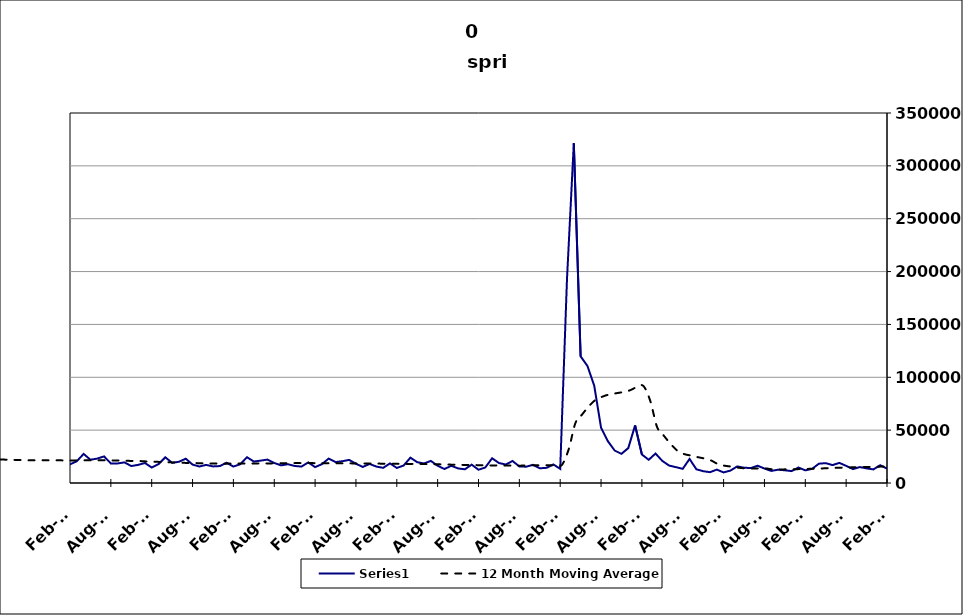
| Category | Series 0 |
|---|---|
| 2005-06-30 | 15559 |
| 2005-07-31 | 18863 |
| 2005-08-31 | 13688 |
| 2005-09-30 | 11216 |
| 2005-10-31 | 15195 |
| 2005-11-30 | 11106 |
| 2005-12-31 | 12178 |
| 2006-01-31 | 12307 |
| 2006-02-28 | 9756 |
| 2006-03-31 | 11166 |
| 2006-04-30 | 18194 |
| 2006-05-31 | 13863 |
| 2006-06-30 | 14337 |
| 2006-07-31 | 17845 |
| 2006-08-31 | 13259 |
| 2006-09-30 | 13170 |
| 2006-10-31 | 14318 |
| 2006-11-30 | 12528 |
| 2006-12-31 | 14662 |
| 2007-01-31 | 14365 |
| 2007-02-28 | 12004 |
| 2007-03-31 | 15715 |
| 2007-04-30 | 21487 |
| 2007-05-31 | 15927 |
| 2007-06-30 | 20117 |
| 2007-07-30 | 19634 |
| 2007-08-31 | 15908 |
| 2007-09-30 | 17289 |
| 2007-10-31 | 17016 |
| 2007-11-15 | 14868 |
| 2007-12-15 09:36:00 | 15051 |
| 2008-01-14 19:12:00 | 19519 |
| 2008-02-14 04:48:00 | 17071 |
| 2008-03-15 14:24:00 | 18041 |
| 2008-04-15 | 26337 |
| 2008-05-15 09:36:00 | 21529 |
| 2008-06-14 19:12:00 | 24509 |
| 2008-07-15 04:48:00 | 26739 |
| 2008-08-14 14:24:00 | 22508 |
| 2008-09-14 | 24197 |
| 2008-10-14 09:36:00 | 30666 |
| 2008-11-13 19:12:00 | 30363 |
| 2008-12-14 04:48:00 | 34409 |
| 2009-01-13 14:24:00 | 39076 |
| 2009-02-13 | 34958 |
| 2009-03-15 09:36:00 | 39174 |
| 2009-04-14 19:12:00 | 41068 |
| 2009-05-15 04:48:00 | 34839 |
| 2009-06-14 14:24:00 | 38758 |
| 2009-07-15 | 38827 |
| 2009-08-14 09:36:00 | 32747 |
| 2009-09-13 19:12:00 | 30654 |
| 2009-10-14 04:48:00 | 31279 |
| 2009-11-13 14:24:00 | 28764 |
| 2009-12-14 | 28567 |
| 2010-01-13 09:36:00 | 31536 |
| 2010-02-12 19:12:00 | 23411 |
| 2010-03-15 04:48:00 | 27064 |
| 2010-04-14 14:24:00 | 31806 |
| 2010-05-15 | 27535 |
| 2010-06-14 09:36:00 | 30999 |
| 2010-07-14 19:12:00 | 30859 |
| 2010-08-14 04:48:00 | 27473 |
| 2010-09-13 14:24:00 | 23569 |
| 2010-10-14 | 26397 |
| 2010-11-13 09:36:00 | 23332 |
| 2010-12-13 19:12:00 | 23208 |
| 2011-01-13 04:48:00 | 29123 |
| 2011-02-12 14:24:00 | 19880 |
| 2011-03-15 | 23037 |
| 2011-04-14 09:36:00 | 29838 |
| 2011-05-14 19:12:00 | 26805 |
| 2011-06-14 04:48:00 | 27951 |
| 2011-07-14 14:24:00 | 27959 |
| 2011-08-14 | 25368 |
| 2011-09-13 09:36:00 | 21516 |
| 2011-10-13 19:12:00 | 25249 |
| 2011-11-13 04:48:00 | 21348 |
| 2011-12-13 14:24:00 | 21373 |
| 2012-01-13 | 26870 |
| 2012-02-12 09:36:00 | 19799 |
| 2012-03-13 19:12:00 | 20523 |
| 2012-04-13 04:48:00 | 29208 |
| 2012-05-13 14:24:00 | 25322 |
| 2012-06-13 | 23562 |
| 2012-07-13 09:36:00 | 27564 |
| 2012-08-12 19:12:00 | 21787 |
| 2012-09-12 04:48:00 | 18024 |
| 2012-10-12 14:24:00 | 22967 |
| 2012-11-12 | 19147 |
| 2012-12-12 09:36:00 | 18332 |
| 2013-01-11 19:12:00 | 24929 |
| 2013-02-11 04:48:00 | 17864 |
| 2013-03-13 14:24:00 | 18518 |
| 2013-04-13 | 27564 |
| 2013-05-13 09:36:00 | 22544 |
| 2013-06-12 19:12:00 | 22178 |
| 2013-07-13 04:48:00 | 25052 |
| 2013-08-12 14:24:00 | 20510 |
| 2013-09-12 | 18652 |
| 2013-10-12 09:36:00 | 23457 |
| 2013-11-11 19:12:00 | 17762 |
| 2013-12-12 04:48:00 | 18554 |
| 2014-01-11 14:24:00 | 23110 |
| 2014-02-11 | 17656 |
| 2014-03-13 09:36:00 | 20574 |
| 2014-04-12 19:12:00 | 27528 |
| 2014-05-13 04:48:00 | 22003 |
| 2014-06-12 14:24:00 | 23093 |
| 2014-07-13 | 25159 |
| 2014-08-12 09:36:00 | 18501 |
| 2014-09-11 19:12:00 | 18519 |
| 2014-10-12 04:48:00 | 19501 |
| 2014-11-11 14:24:00 | 16036 |
| 2014-12-12 | 17142 |
| 2015-01-11 09:36:00 | 18920 |
| 2015-02-10 19:12:00 | 14673 |
| 2015-03-13 04:48:00 | 17842 |
| 2015-04-12 14:24:00 | 24284 |
| 2015-05-13 | 19120 |
| 2015-06-12 09:36:00 | 20073 |
| 2015-07-12 19:12:00 | 23007 |
| 2015-08-12 04:48:00 | 17420 |
| 2015-09-11 14:24:00 | 15620 |
| 2015-10-12 | 17117 |
| 2015-11-11 09:36:00 | 15685 |
| 2015-12-11 19:12:00 | 16020 |
| 2016-01-11 04:48:00 | 19143 |
| 2016-02-10 14:24:00 | 15551 |
| 2016-03-12 | 17721 |
| 2016-04-11 09:36:00 | 24381 |
| 2016-05-11 19:12:00 | 20319 |
| 2016-06-11 04:48:00 | 21157 |
| 2016-07-11 14:24:00 | 22155 |
| 2016-08-11 | 18945 |
| 2016-09-10 09:36:00 | 16699 |
| 2016-10-10 19:12:00 | 17773 |
| 2016-11-10 04:48:00 | 16104 |
| 2016-12-10 14:24:00 | 15555 |
| 2017-01-10 | 19468 |
| 2017-02-09 09:36:00 | 15031 |
| 2017-03-11 19:12:00 | 17840 |
| 2017-04-11 04:48:00 | 23124 |
| 2017-05-11 14:24:00 | 19802 |
| 2017-06-11 | 20588 |
| 2017-07-11 09:36:00 | 21858 |
| 2017-08-10 19:12:00 | 18231 |
| 2017-09-10 04:48:00 | 15171 |
| 2017-10-10 14:24:00 | 18027 |
| 2017-11-10 | 15538 |
| 2017-12-10 09:36:00 | 14339 |
| 2018-01-09 19:12:00 | 18538 |
| 2018-02-09 04:48:00 | 14230 |
| 2018-03-11 14:24:00 | 16525 |
| 2018-04-11 | 23962 |
| 2018-05-11 09:36:00 | 19679 |
| 2018-06-10 19:12:00 | 18492 |
| 2018-07-11 04:48:00 | 20879 |
| 2018-08-10 14:24:00 | 16306 |
| 2018-09-10 | 13227 |
| 2018-10-10 09:36:00 | 16273 |
| 2018-11-09 19:12:00 | 13796 |
| 2018-12-10 04:48:00 | 12964 |
| 2019-01-09 14:24:00 | 17391 |
| 2019-02-09 | 12534 |
| 2019-03-11 09:36:00 | 14705 |
| 2019-04-10 19:12:00 | 23399 |
| 2019-05-11 04:48:00 | 18895 |
| 2019-06-10 14:24:00 | 17486 |
| 2019-07-11 | 20792 |
| 2019-08-10 09:36:00 | 15676 |
| 2019-09-09 19:12:00 | 15415 |
| 2019-10-10 04:48:00 | 17202 |
| 2019-11-09 14:24:00 | 13905 |
| 2019-12-10 | 14356 |
| 2020-01-09 09:36:00 | 17551 |
| 2020-02-08 19:12:00 | 13374 |
| 2020-03-10 04:48:00 | 193236 |
| 2020-04-09 14:24:00 | 321397 |
| 2020-05-10 | 119809 |
| 2020-06-09 09:36:00 | 110709 |
| 2020-07-09 19:12:00 | 91992 |
| 2020-08-09 04:48:00 | 52303 |
| 2020-09-08 14:24:00 | 39616 |
| 2020-10-09 | 30687 |
| 2020-11-08 09:36:00 | 27606 |
| 2020-12-08 19:12:00 | 32990 |
| 2021-01-08 04:48:00 | 54483 |
| 2021-02-07 14:24:00 | 26952 |
| 2021-03-10 | 21951 |
| 2021-04-09 09:36:00 | 27881 |
| 2021-05-09 19:12:00 | 20877 |
| 2021-06-09 04:48:00 | 16503 |
| 2021-07-09 14:24:00 | 14975 |
| 2021-08-09 | 13409 |
| 2021-09-08 09:36:00 | 22784 |
| 2021-10-08 19:12:00 | 12970 |
| 2021-11-08 04:48:00 | 11178 |
| 2021-12-08 14:24:00 | 10213 |
| 2022-01-08 | 12675 |
| 2022-02-07 09:36:00 | 10001 |
| 2022-03-09 19:12:00 | 11739 |
| 2022-04-09 04:48:00 | 15679 |
| 2022-05-09 14:24:00 | 14464 |
| 2022-06-09 | 14143 |
| 2022-07-09 09:36:00 | 16322 |
| 2022-08-08 19:12:00 | 13673 |
| 2022-09-08 04:48:00 | 11418 |
| 2022-10-08 14:24:00 | 12593 |
| 2022-11-08 | 12027 |
| 2022-12-08 09:36:00 | 11247 |
| 2023-01-07 19:12:00 | 14638 |
| 2023-02-07 04:48:00 | 11960 |
| 2023-03-09 14:24:00 | 13385 |
| 2023-04-09 | 18262 |
| 2023-05-09 09:36:00 | 18799 |
| 2023-06-08 19:12:00 | 16928 |
| 2023-07-09 04:48:00 | 19035 |
| 2023-08-08 14:24:00 | 16202 |
| 2023-09-08 | 13123 |
| 2023-10-08 09:36:00 | 15075 |
| 2023-11-07 19:12:00 | 13832 |
| 2023-12-08 04:48:00 | 12849 |
| 2024-01-07 14:24:00 | 16797 |
| 2024-02-07 | 13632 |